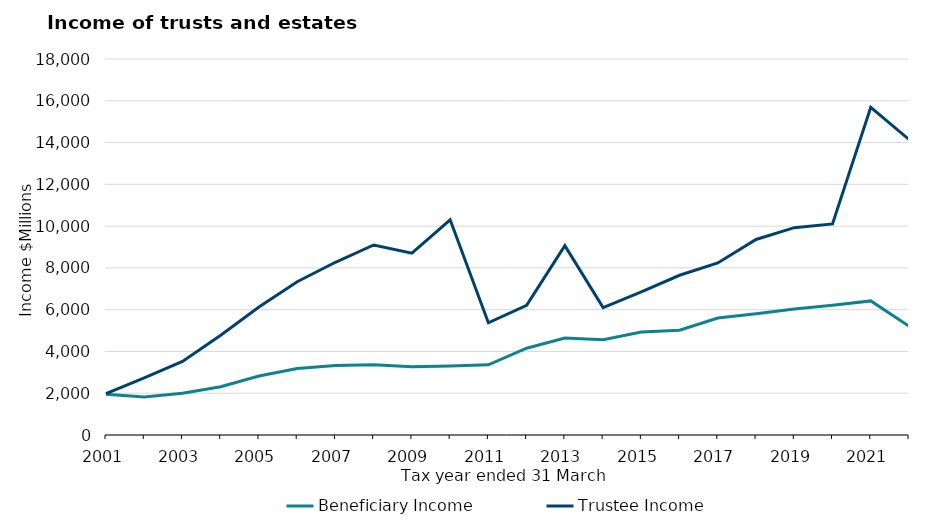
| Category | Beneficiary Income | Trustee Income |
|---|---|---|
| 2001.0 | 1950.3 | 1979.6 |
| 2002.0 | 1823.9 | 2732.4 |
| 2003.0 | 1995.5 | 3520.3 |
| 2004.0 | 2311.7 | 4774.3 |
| 2005.0 | 2822.8 | 6126.5 |
| 2006.0 | 3180.8 | 7338.1 |
| 2007.0 | 3329.8 | 8268.4 |
| 2008.0 | 3362.3 | 9097.6 |
| 2009.0 | 3267 | 8704.3 |
| 2010.0 | 3308.5 | 10303.3 |
| 2011.0 | 3357.1 | 5373.8 |
| 2012.0 | 4154.4 | 6210.9 |
| 2013.0 | 4638.6 | 9065.1 |
| 2014.0 | 4565.6 | 6098.4 |
| 2015.0 | 4926.4 | 6851.9 |
| 2016.0 | 5012.6 | 7646.8 |
| 2017.0 | 5601.2 | 8235.9 |
| 2018.0 | 5809.3 | 9360.2 |
| 2019.0 | 6036.4 | 9925.7 |
| 2020.0 | 6209.1 | 10105.8 |
| 2021.0 | 6419.4 | 15690 |
| 2022.0 | 5212.8 | 14147.5 |